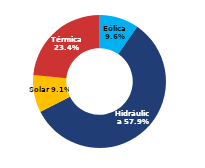
| Category | Sur |
|---|---|
| Eólica | 60.409 |
| Hidráulica | 364.596 |
| Solar | 57.417 |
| Térmica | 147.576 |